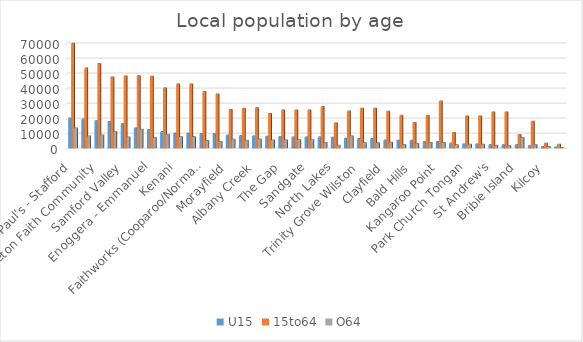
| Category | U15 | 15to64 | O64 |
|---|---|---|---|
| St Paul's - Stafford | 20034 | 69841 | 13356 |
| Pine Rivers | 19343 | 53281 | 8010 |
| Moreton Faith Community | 18158 | 56415 | 8694 |
| Caboolture | 17723 | 47434 | 10932 |
| Samford Valley | 16261 | 48071 | 7380 |
| Aspley | 13434 | 48245 | 12594 |
| Enoggera - Emmanuel | 12340 | 47930 | 7028 |
| Chermside Kedron | 10830 | 40046 | 9180 |
| Kenani | 9822 | 42734 | 7617 |
| Wavell Hts/Geebung | 9822 | 42734 | 7617 |
| Faithworks (Cooparoo/Norman Park) | 9675 | 37634 | 5158 |
| South East (Morningside) | 9642 | 36105 | 4432 |
| Morayfield | 8717 | 25732 | 5864 |
| Arana Hills | 8197 | 26551 | 5320 |
| Albany Creek | 8138 | 26861 | 6011 |
| Deception Bay | 7917 | 23130 | 5408 |
| The Gap | 7588 | 25414 | 5453 |
| Bracken Ridge | 7401 | 25432 | 5517 |
| Sandgate | 7401 | 25432 | 5517 |
| Ashgrove West | 7394 | 27656 | 3745 |
| North Lakes | 7286 | 16774 | 1975 |
| Redcliffe | 6651 | 24683 | 8116 |
| Trinity Grove Wilston | 6387 | 26568 | 3528 |
| Windsor | 6387 | 26568 | 3528 |
| Clayfield | 5330 | 24596 | 3965 |
| Bulimba | 5298 | 21891 | 2391 |
| Bald Hills | 5198 | 17141 | 3079 |
| St Luke's Hamilton | 4449 | 21724 | 3816 |
| Kangaroo Point | 4420 | 31365 | 3682 |
| Dayboro | 3333 | 10409 | 2178 |
| Park Church Tongan | 2803 | 21475 | 2613 |
| West End | 2803 | 21475 | 2613 |
| St Andrew's | 2188 | 24112 | 1682 |
| WMB Albert Street | 2188 | 24112 | 1682 |
| Bribie Island | 2176 | 8997 | 6960 |
| Merthyr Road | 1549 | 17865 | 2321 |
| Kilcoy | 1106 | 3247 | 1010 |
| Elimbah | 810 | 2588 | 471 |